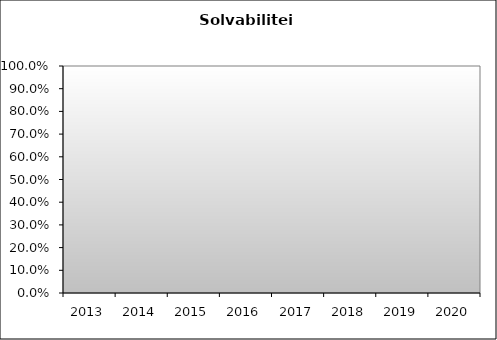
| Category | Series 0 |
|---|---|
| 2013.0 | 0 |
| 2014.0 | 0 |
| 2015.0 | 0 |
| 2016.0 | 0 |
| 2017.0 | 0 |
| 2018.0 | 0 |
| 2019.0 | 0 |
| 2020.0 | 0 |